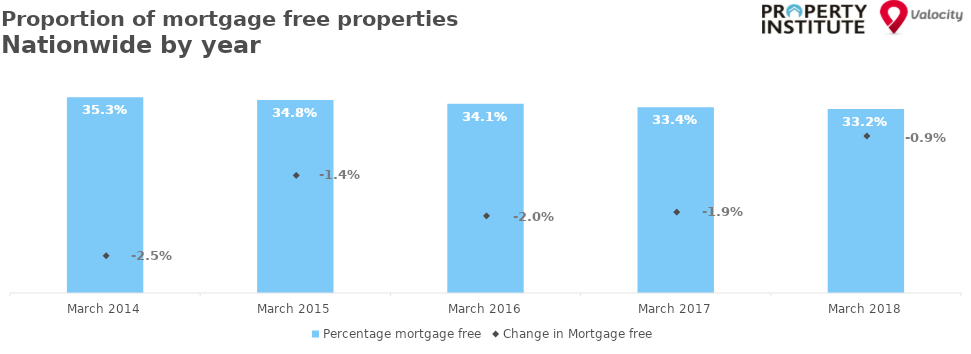
| Category | Percentage mortgage free |
|---|---|
| 2014-03-01 | 0.353 |
| 2015-03-01 | 0.348 |
| 2016-03-01 | 0.341 |
| 2017-03-01 | 0.334 |
| 2018-03-01 | 0.332 |